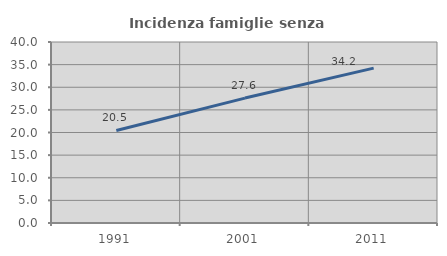
| Category | Incidenza famiglie senza nuclei |
|---|---|
| 1991.0 | 20.452 |
| 2001.0 | 27.605 |
| 2011.0 | 34.224 |